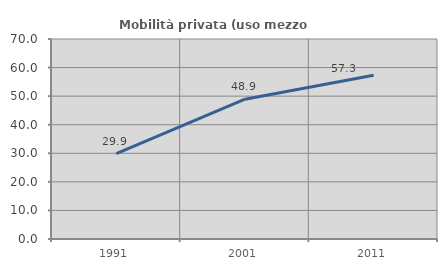
| Category | Mobilità privata (uso mezzo privato) |
|---|---|
| 1991.0 | 29.882 |
| 2001.0 | 48.945 |
| 2011.0 | 57.347 |